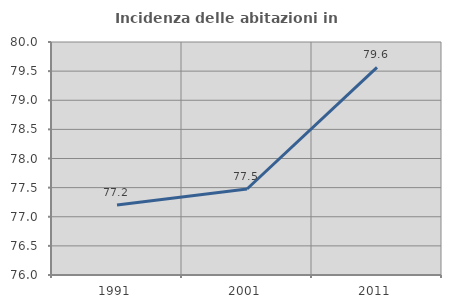
| Category | Incidenza delle abitazioni in proprietà  |
|---|---|
| 1991.0 | 77.2 |
| 2001.0 | 77.477 |
| 2011.0 | 79.563 |